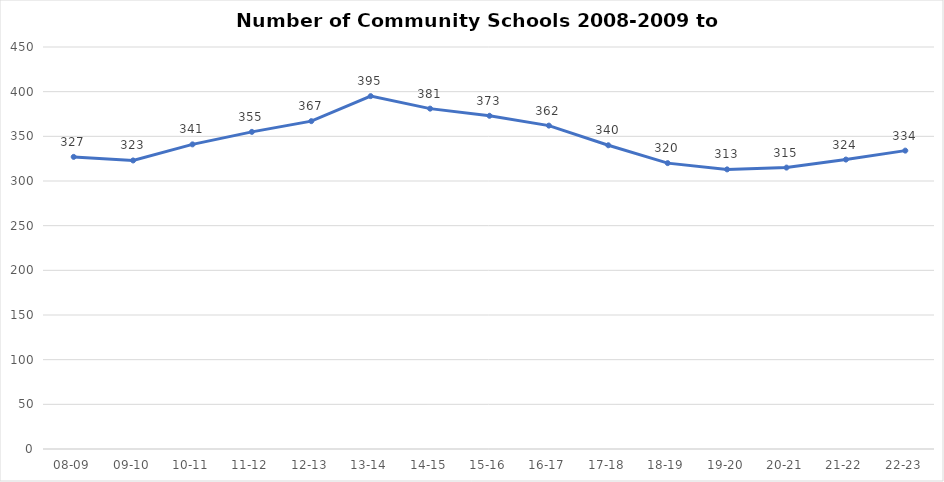
| Category | N of Schools |
|---|---|
| 08-09 | 327 |
| 09-10 | 323 |
| 10-11 | 341 |
| 11-12 | 355 |
| 12-13 | 367 |
| 13-14 | 395 |
| 14-15 | 381 |
| 15-16 | 373 |
| 16-17 | 362 |
| 17-18 | 340 |
| 18-19 | 320 |
| 19-20 | 313 |
| 20-21 | 315 |
| 21-22 | 324 |
| 22-23 | 334 |